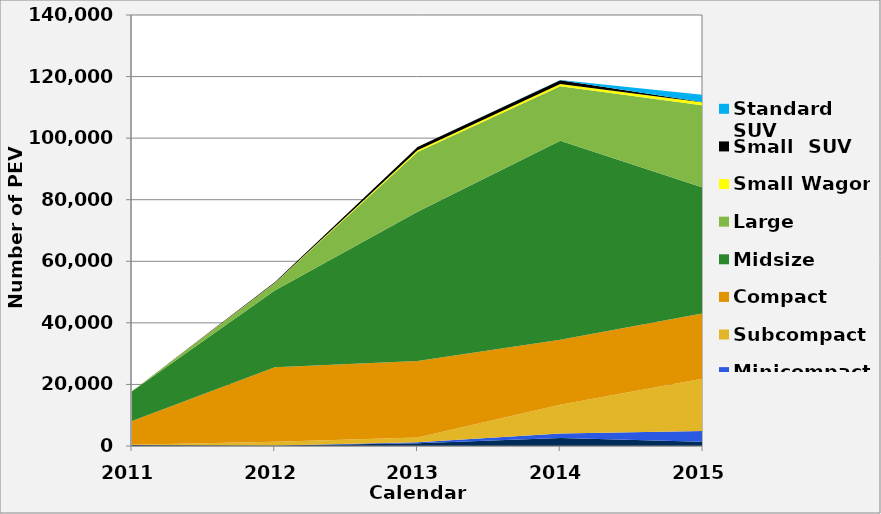
| Category | Two-seater | Minicompact | Subcompact | Compact | Midsize | Large  | Small Wagon | Small  SUV | Standard SUV |
|---|---|---|---|---|---|---|---|---|---|
| 2011.0 | 342 | 0 | 76 | 7671 | 9674 | 0 | 0 | 0 | 0 |
| 2012.0 | 139 | 0 | 1259 | 24144 | 24942 | 2400 | 93 | 192 | 0 |
| 2013.0 | 923 | 260 | 1595 | 24832 | 48467 | 19451 | 569 | 1005 | 0 |
| 2014.0 | 2594 | 1503 | 9298 | 21126 | 64670 | 17629 | 766 | 1184 | 112 |
| 2015.0 | 1387 | 3477 | 17057 | 21207 | 40786 | 26725 | 1017 | 18 | 2349 |